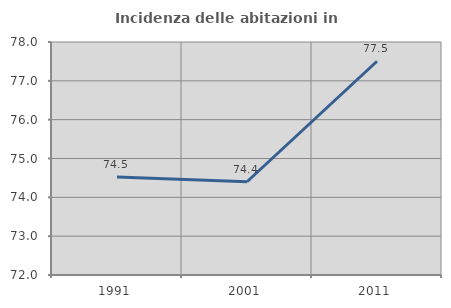
| Category | Incidenza delle abitazioni in proprietà  |
|---|---|
| 1991.0 | 74.526 |
| 2001.0 | 74.401 |
| 2011.0 | 77.504 |